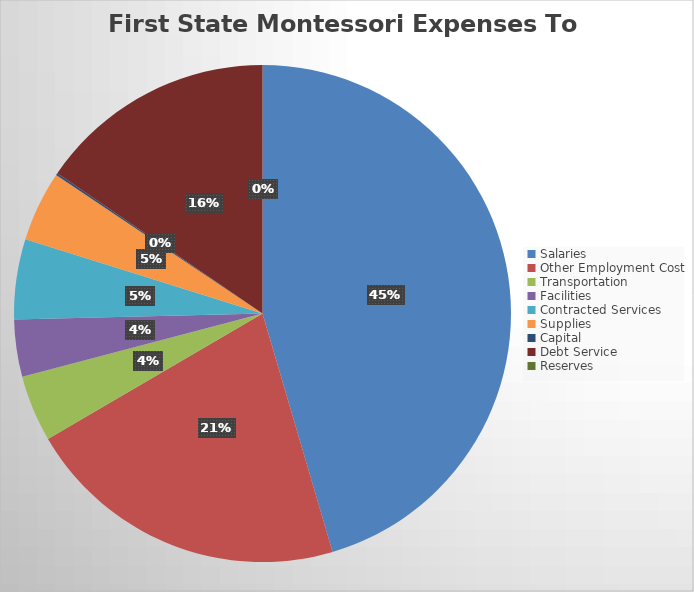
| Category | Series 0 |
|---|---|
| Salaries | 2246871.04 |
| Other Employment Cost | 1044655.8 |
| Transportation | 213654.76 |
| Facilities | 183563.28 |
| Contracted Services | 258125.17 |
| Supplies | 225985.13 |
| Capital | 6645.6 |
| Debt Service | 764340.32 |
| Reserves | 0 |